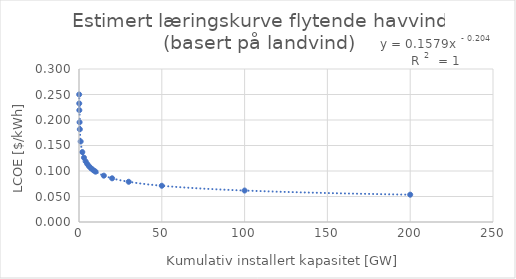
| Category | y |
|---|---|
| 0.105 | 0.25 |
| 0.15 | 0.232 |
| 0.2 | 0.219 |
| 0.35 | 0.196 |
| 0.5 | 0.182 |
| 1.0 | 0.158 |
| 2.0 | 0.137 |
| 3.0 | 0.126 |
| 4.0 | 0.119 |
| 5.0 | 0.114 |
| 6.0 | 0.11 |
| 7.0 | 0.106 |
| 8.0 | 0.103 |
| 9.0 | 0.101 |
| 10.0 | 0.099 |
| 15.0 | 0.091 |
| 20.0 | 0.086 |
| 30.0 | 0.079 |
| 50.0 | 0.071 |
| 100.0 | 0.062 |
| 200.0 | 0.054 |